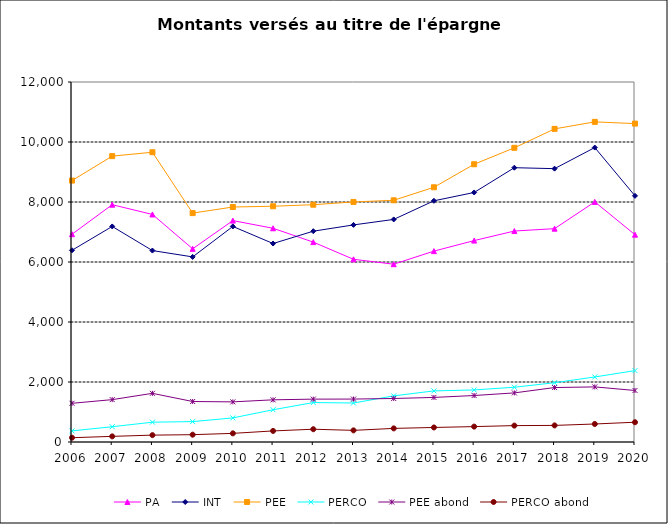
| Category | PA | INT | PEE | PERCO | PEE abond | PERCO abond |
|---|---|---|---|---|---|---|
| 2006.0 | 6926 | 6391 | 8714 | 371 | 1290 | 143 |
| 2007.0 | 7910 | 7185 | 9529 | 509 | 1412 | 188 |
| 2008.0 | 7585 | 6381 | 9659 | 660 | 1622 | 229 |
| 2009.0 | 6439 | 6170 | 7630 | 680 | 1350 | 244 |
| 2010.0 | 7380 | 7185 | 7833 | 803 | 1338 | 288 |
| 2011.0 | 7124 | 6616 | 7858 | 1075 | 1406 | 369 |
| 2012.0 | 6663 | 7027 | 7910 | 1315 | 1429 | 426 |
| 2013.0 | 6090 | 7236 | 8002 | 1300 | 1431 | 388 |
| 2014.0 | 5926.745 | 7419.102 | 8057.099 | 1537.998 | 1450.088 | 453.633 |
| 2015.0 | 6362.814 | 8040.096 | 8490.897 | 1703.176 | 1485.813 | 484.488 |
| 2016.0 | 6714 | 8317.574 | 9258.645 | 1735.036 | 1549.001 | 513.053 |
| 2017.0 | 7032.076 | 9143.599 | 9806.067 | 1825.971 | 1636.834 | 546.809 |
| 2018.0 | 7111.642 | 9111.429 | 10437.224 | 1975.973 | 1815.118 | 552.641 |
| 2019.0 | 8003.187 | 9814.935 | 10671.206 | 2168.084 | 1836.712 | 600.327 |
| 2020.0 | 6909.962 | 8205.24 | 10613.286 | 2379.69 | 1717.344 | 659.188 |